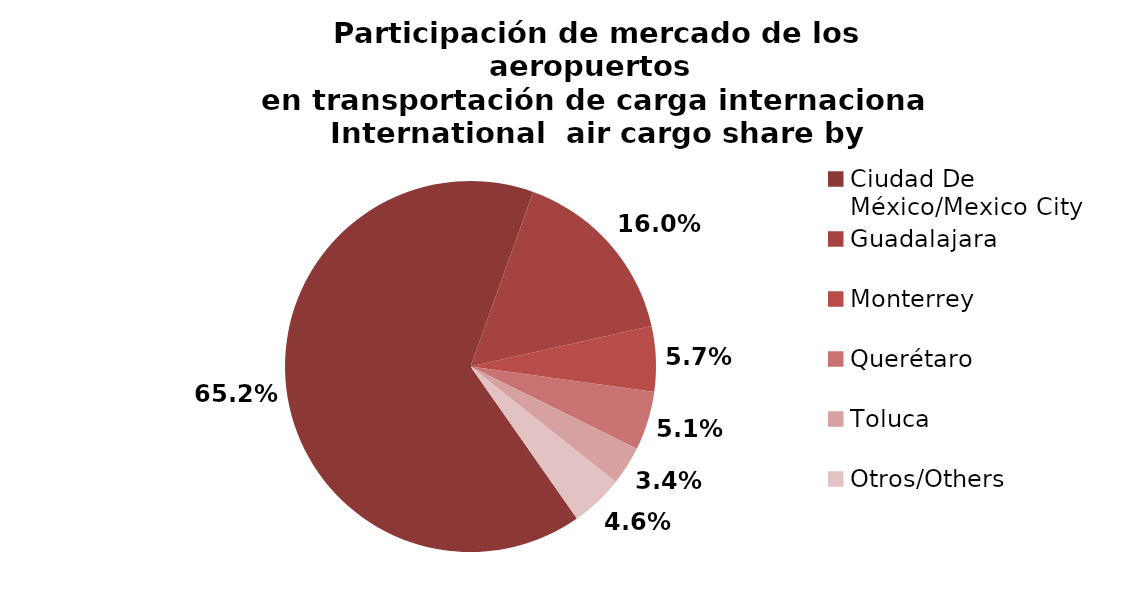
| Category | Series 0 |
|---|---|
| Ciudad De México/Mexico City | 38560.64 |
| Guadalajara | 9473.968 |
| Monterrey | 3357.243 |
| Querétaro | 3035.808 |
| Toluca | 1990.581 |
| Otros/Others | 2716.383 |